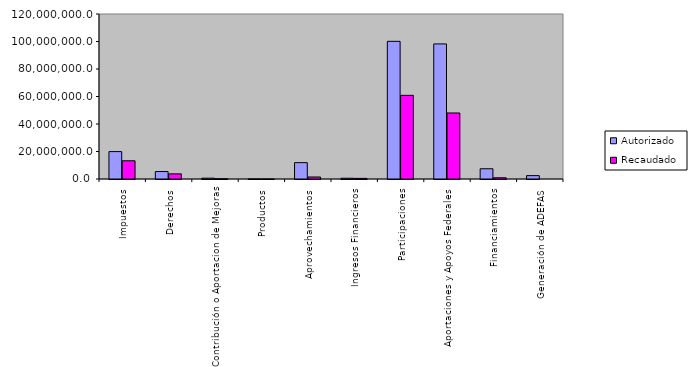
| Category | Autorizado | Recaudado |
|---|---|---|
| Impuestos | 19920975.3 | 13256084.2 |
| Derechos | 5418672.7 | 3737892.6 |
| Contribución o Aportacion de Mejoras | 597997.6 | 150165.6 |
| Productos | 15085.6 | 6648.3 |
| Aprovechamientos | 11889239 | 1462412.4 |
| Ingresos Financieros | 546000 | 447957.7 |
| Participaciones | 100121034.8 | 60830519.9 |
| Aportaciones y Apoyos Federales | 98233591.4 | 48015583.3 |
| Financiamientos | 7446706.6 | 902930 |
| Generación de ADEFAS | 2460661.3 | 0 |